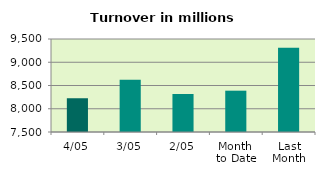
| Category | Series 0 |
|---|---|
| 4/05 | 8225.847 |
| 3/05 | 8622.093 |
| 2/05 | 8317.58 |
| Month 
to Date | 8388.507 |
| Last
Month | 9311.354 |